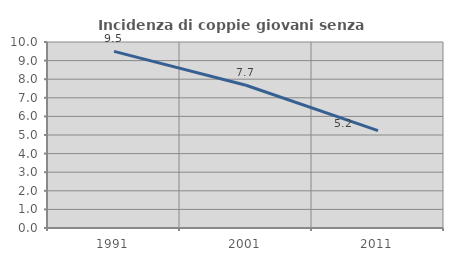
| Category | Incidenza di coppie giovani senza figli |
|---|---|
| 1991.0 | 9.497 |
| 2001.0 | 7.673 |
| 2011.0 | 5.233 |